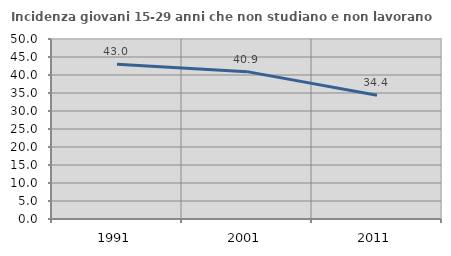
| Category | Incidenza giovani 15-29 anni che non studiano e non lavorano  |
|---|---|
| 1991.0 | 42.981 |
| 2001.0 | 40.934 |
| 2011.0 | 34.36 |